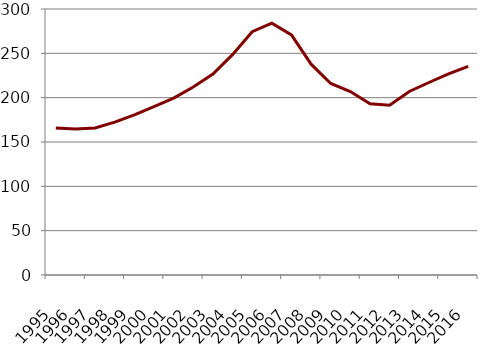
| Category | Series 0 |
|---|---|
| 1995.0 | 165.836 |
| 1996.0 | 164.744 |
| 1997.0 | 165.859 |
| 1998.0 | 172.48 |
| 1999.0 | 180.538 |
| 2000.0 | 189.82 |
| 2001.0 | 199.438 |
| 2002.0 | 212.088 |
| 2003.0 | 226.736 |
| 2004.0 | 248.472 |
| 2005.0 | 274.423 |
| 2006.0 | 283.981 |
| 2007.0 | 270.731 |
| 2008.0 | 237.783 |
| 2009.0 | 215.998 |
| 2010.0 | 206.927 |
| 2011.0 | 193.111 |
| 2012.0 | 191.58 |
| 2013.0 | 206.973 |
| 2014.0 | 217.105 |
| 2015.0 | 226.758 |
| 2016.0 | 235.405 |